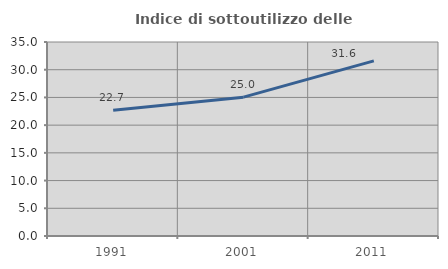
| Category | Indice di sottoutilizzo delle abitazioni  |
|---|---|
| 1991.0 | 22.667 |
| 2001.0 | 25.048 |
| 2011.0 | 31.596 |